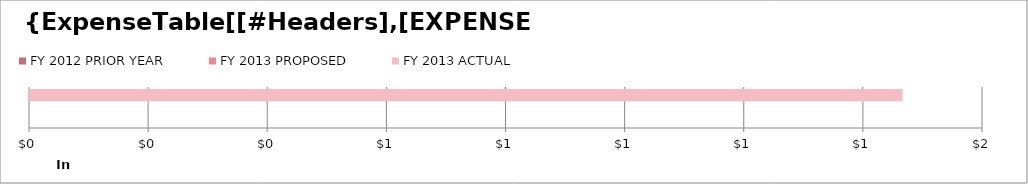
| Category | FY 2012 PRIOR YEAR | FY 2013 PROPOSED | FY 2013 ACTUAL |
|---|---|---|---|
| 0 | 0 | 0 | 1465 |